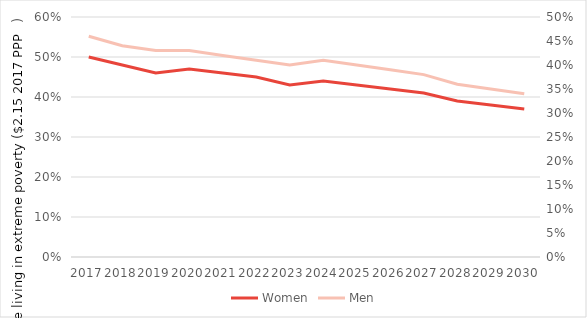
| Category | Women |
|---|---|
| 2017 | 0.5 |
| 2018 | 0.48 |
| 2019 | 0.46 |
| 2020 | 0.47 |
| 2021 | 0.46 |
| 2022 | 0.45 |
| 2023 | 0.43 |
| 2024 | 0.44 |
| 2025 | 0.43 |
| 2026 | 0.42 |
| 2027 | 0.41 |
| 2028 | 0.39 |
| 2029 | 0.38 |
| 2030 | 0.37 |